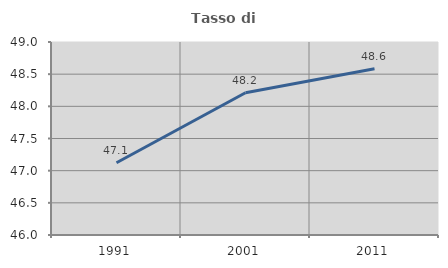
| Category | Tasso di occupazione   |
|---|---|
| 1991.0 | 47.123 |
| 2001.0 | 48.212 |
| 2011.0 | 48.584 |